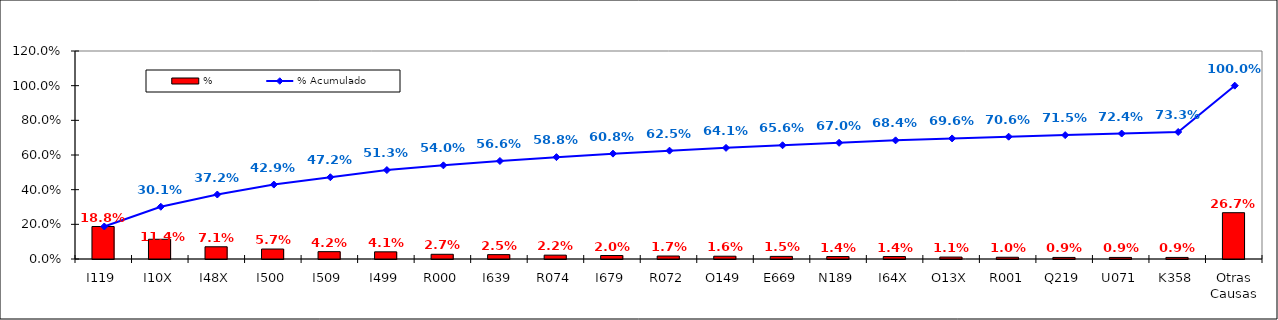
| Category | % |
|---|---|
| I119 | 0.188 |
| I10X | 0.114 |
| I48X | 0.071 |
| I500 | 0.057 |
| I509 | 0.042 |
| I499 | 0.041 |
| R000 | 0.027 |
| I639 | 0.025 |
| R074 | 0.022 |
| I679 | 0.02 |
| R072 | 0.017 |
| O149 | 0.016 |
| E669 | 0.015 |
| N189 | 0.014 |
| I64X | 0.014 |
| O13X | 0.011 |
| R001 | 0.01 |
| Q219 | 0.009 |
| U071 | 0.009 |
| K358 | 0.009 |
| Otras Causas | 0.267 |